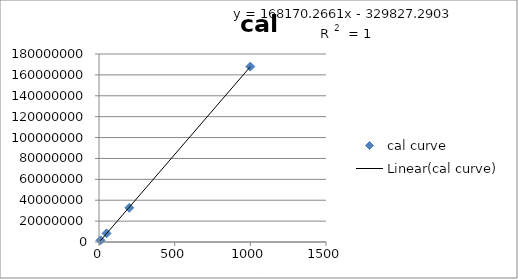
| Category | cal curve |
|---|---|
| 10.0 | 1636167.673 |
| 50.0 | 8241437.513 |
| 200.0 | 32759146.797 |
| 1000.0 | 167938474.123 |